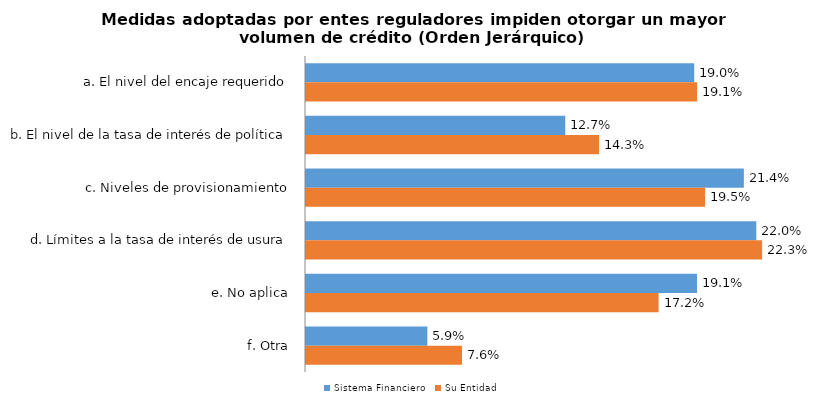
| Category | Sistema Financiero | Su Entidad |
|---|---|---|
| a. El nivel del encaje requerido | 0.19 | 0.191 |
| b. El nivel de la tasa de interés de política | 0.127 | 0.143 |
| c. Niveles de provisionamiento | 0.214 | 0.195 |
| d. Límites a la tasa de interés de usura | 0.22 | 0.223 |
| e. No aplica | 0.191 | 0.172 |
| f. Otra | 0.059 | 0.076 |